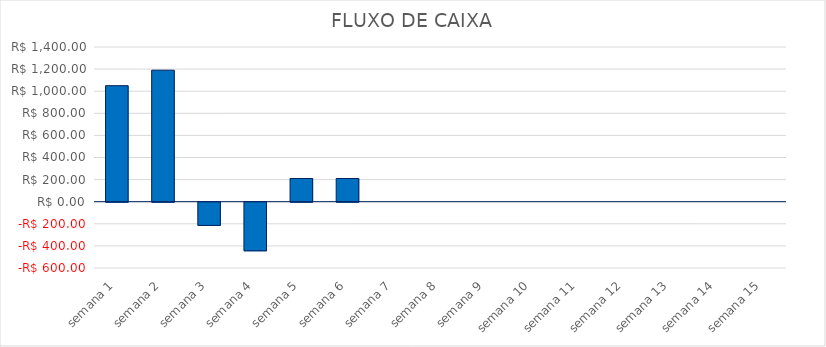
| Category | SALDO FLUXO DE CAIXA   |
|---|---|
| semana 1 | 1050 |
| semana 2 | 1190 |
| semana 3 | -210 |
| semana 4 | -440 |
| semana 5 | 210 |
| semana 6 | 210 |
| semana 7 | 0 |
| semana 8 | 0 |
| semana 9 | 0 |
| semana 10 | 0 |
| semana 11 | 0 |
| semana 12 | 0 |
| semana 13 | 0 |
| semana 14 | 0 |
| semana 15 | 0 |